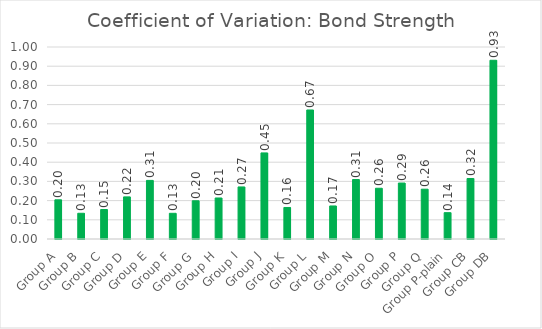
| Category | Coefficient of Variation |
|---|---|
| Group A | 0.204 |
| Group B | 0.134 |
| Group C | 0.154 |
| Group D | 0.219 |
| Group E | 0.305 |
| Group F | 0.134 |
| Group G | 0.199 |
| Group H | 0.214 |
| Group I | 0.271 |
| Group J | 0.448 |
| Group K | 0.164 |
| Group L | 0.672 |
| Group M | 0.172 |
| Group N | 0.31 |
| Group O | 0.264 |
| Group P | 0.291 |
| Group Q | 0.259 |
| Group P-plain | 0.137 |
| Group CB | 0.315 |
| Group DB | 0.931 |